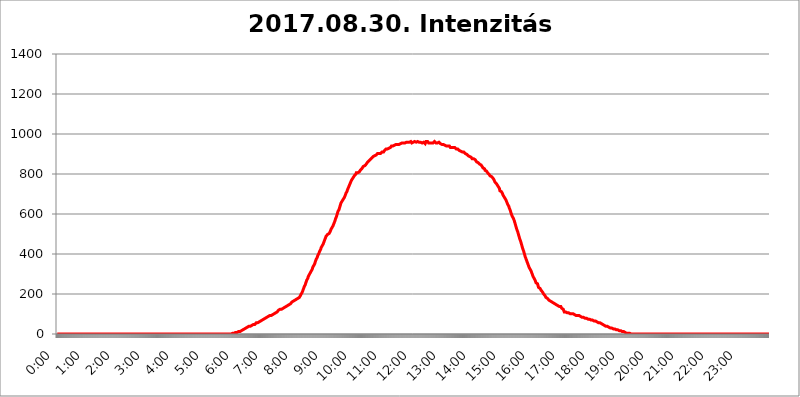
| Category | 2017.08.30. Intenzitás [W/m^2] |
|---|---|
| 0.0 | 0 |
| 0.0006944444444444445 | 0 |
| 0.001388888888888889 | 0 |
| 0.0020833333333333333 | 0 |
| 0.002777777777777778 | 0 |
| 0.003472222222222222 | 0 |
| 0.004166666666666667 | 0 |
| 0.004861111111111111 | 0 |
| 0.005555555555555556 | 0 |
| 0.0062499999999999995 | 0 |
| 0.006944444444444444 | 0 |
| 0.007638888888888889 | 0 |
| 0.008333333333333333 | 0 |
| 0.009027777777777779 | 0 |
| 0.009722222222222222 | 0 |
| 0.010416666666666666 | 0 |
| 0.011111111111111112 | 0 |
| 0.011805555555555555 | 0 |
| 0.012499999999999999 | 0 |
| 0.013194444444444444 | 0 |
| 0.013888888888888888 | 0 |
| 0.014583333333333332 | 0 |
| 0.015277777777777777 | 0 |
| 0.015972222222222224 | 0 |
| 0.016666666666666666 | 0 |
| 0.017361111111111112 | 0 |
| 0.018055555555555557 | 0 |
| 0.01875 | 0 |
| 0.019444444444444445 | 0 |
| 0.02013888888888889 | 0 |
| 0.020833333333333332 | 0 |
| 0.02152777777777778 | 0 |
| 0.022222222222222223 | 0 |
| 0.02291666666666667 | 0 |
| 0.02361111111111111 | 0 |
| 0.024305555555555556 | 0 |
| 0.024999999999999998 | 0 |
| 0.025694444444444447 | 0 |
| 0.02638888888888889 | 0 |
| 0.027083333333333334 | 0 |
| 0.027777777777777776 | 0 |
| 0.02847222222222222 | 0 |
| 0.029166666666666664 | 0 |
| 0.029861111111111113 | 0 |
| 0.030555555555555555 | 0 |
| 0.03125 | 0 |
| 0.03194444444444445 | 0 |
| 0.03263888888888889 | 0 |
| 0.03333333333333333 | 0 |
| 0.034027777777777775 | 0 |
| 0.034722222222222224 | 0 |
| 0.035416666666666666 | 0 |
| 0.036111111111111115 | 0 |
| 0.03680555555555556 | 0 |
| 0.0375 | 0 |
| 0.03819444444444444 | 0 |
| 0.03888888888888889 | 0 |
| 0.03958333333333333 | 0 |
| 0.04027777777777778 | 0 |
| 0.04097222222222222 | 0 |
| 0.041666666666666664 | 0 |
| 0.042361111111111106 | 0 |
| 0.04305555555555556 | 0 |
| 0.043750000000000004 | 0 |
| 0.044444444444444446 | 0 |
| 0.04513888888888889 | 0 |
| 0.04583333333333334 | 0 |
| 0.04652777777777778 | 0 |
| 0.04722222222222222 | 0 |
| 0.04791666666666666 | 0 |
| 0.04861111111111111 | 0 |
| 0.049305555555555554 | 0 |
| 0.049999999999999996 | 0 |
| 0.05069444444444445 | 0 |
| 0.051388888888888894 | 0 |
| 0.052083333333333336 | 0 |
| 0.05277777777777778 | 0 |
| 0.05347222222222222 | 0 |
| 0.05416666666666667 | 0 |
| 0.05486111111111111 | 0 |
| 0.05555555555555555 | 0 |
| 0.05625 | 0 |
| 0.05694444444444444 | 0 |
| 0.057638888888888885 | 0 |
| 0.05833333333333333 | 0 |
| 0.05902777777777778 | 0 |
| 0.059722222222222225 | 0 |
| 0.06041666666666667 | 0 |
| 0.061111111111111116 | 0 |
| 0.06180555555555556 | 0 |
| 0.0625 | 0 |
| 0.06319444444444444 | 0 |
| 0.06388888888888888 | 0 |
| 0.06458333333333334 | 0 |
| 0.06527777777777778 | 0 |
| 0.06597222222222222 | 0 |
| 0.06666666666666667 | 0 |
| 0.06736111111111111 | 0 |
| 0.06805555555555555 | 0 |
| 0.06874999999999999 | 0 |
| 0.06944444444444443 | 0 |
| 0.07013888888888889 | 0 |
| 0.07083333333333333 | 0 |
| 0.07152777777777779 | 0 |
| 0.07222222222222223 | 0 |
| 0.07291666666666667 | 0 |
| 0.07361111111111111 | 0 |
| 0.07430555555555556 | 0 |
| 0.075 | 0 |
| 0.07569444444444444 | 0 |
| 0.0763888888888889 | 0 |
| 0.07708333333333334 | 0 |
| 0.07777777777777778 | 0 |
| 0.07847222222222222 | 0 |
| 0.07916666666666666 | 0 |
| 0.0798611111111111 | 0 |
| 0.08055555555555556 | 0 |
| 0.08125 | 0 |
| 0.08194444444444444 | 0 |
| 0.08263888888888889 | 0 |
| 0.08333333333333333 | 0 |
| 0.08402777777777777 | 0 |
| 0.08472222222222221 | 0 |
| 0.08541666666666665 | 0 |
| 0.08611111111111112 | 0 |
| 0.08680555555555557 | 0 |
| 0.08750000000000001 | 0 |
| 0.08819444444444445 | 0 |
| 0.08888888888888889 | 0 |
| 0.08958333333333333 | 0 |
| 0.09027777777777778 | 0 |
| 0.09097222222222222 | 0 |
| 0.09166666666666667 | 0 |
| 0.09236111111111112 | 0 |
| 0.09305555555555556 | 0 |
| 0.09375 | 0 |
| 0.09444444444444444 | 0 |
| 0.09513888888888888 | 0 |
| 0.09583333333333333 | 0 |
| 0.09652777777777777 | 0 |
| 0.09722222222222222 | 0 |
| 0.09791666666666667 | 0 |
| 0.09861111111111111 | 0 |
| 0.09930555555555555 | 0 |
| 0.09999999999999999 | 0 |
| 0.10069444444444443 | 0 |
| 0.1013888888888889 | 0 |
| 0.10208333333333335 | 0 |
| 0.10277777777777779 | 0 |
| 0.10347222222222223 | 0 |
| 0.10416666666666667 | 0 |
| 0.10486111111111111 | 0 |
| 0.10555555555555556 | 0 |
| 0.10625 | 0 |
| 0.10694444444444444 | 0 |
| 0.1076388888888889 | 0 |
| 0.10833333333333334 | 0 |
| 0.10902777777777778 | 0 |
| 0.10972222222222222 | 0 |
| 0.1111111111111111 | 0 |
| 0.11180555555555556 | 0 |
| 0.11180555555555556 | 0 |
| 0.1125 | 0 |
| 0.11319444444444444 | 0 |
| 0.11388888888888889 | 0 |
| 0.11458333333333333 | 0 |
| 0.11527777777777777 | 0 |
| 0.11597222222222221 | 0 |
| 0.11666666666666665 | 0 |
| 0.1173611111111111 | 0 |
| 0.11805555555555557 | 0 |
| 0.11944444444444445 | 0 |
| 0.12013888888888889 | 0 |
| 0.12083333333333333 | 0 |
| 0.12152777777777778 | 0 |
| 0.12222222222222223 | 0 |
| 0.12291666666666667 | 0 |
| 0.12291666666666667 | 0 |
| 0.12361111111111112 | 0 |
| 0.12430555555555556 | 0 |
| 0.125 | 0 |
| 0.12569444444444444 | 0 |
| 0.12638888888888888 | 0 |
| 0.12708333333333333 | 0 |
| 0.16875 | 0 |
| 0.12847222222222224 | 0 |
| 0.12916666666666668 | 0 |
| 0.12986111111111112 | 0 |
| 0.13055555555555556 | 0 |
| 0.13125 | 0 |
| 0.13194444444444445 | 0 |
| 0.1326388888888889 | 0 |
| 0.13333333333333333 | 0 |
| 0.13402777777777777 | 0 |
| 0.13402777777777777 | 0 |
| 0.13472222222222222 | 0 |
| 0.13541666666666666 | 0 |
| 0.1361111111111111 | 0 |
| 0.13749999999999998 | 0 |
| 0.13819444444444443 | 0 |
| 0.1388888888888889 | 0 |
| 0.13958333333333334 | 0 |
| 0.14027777777777778 | 0 |
| 0.14097222222222222 | 0 |
| 0.14166666666666666 | 0 |
| 0.1423611111111111 | 0 |
| 0.14305555555555557 | 0 |
| 0.14375000000000002 | 0 |
| 0.14444444444444446 | 0 |
| 0.1451388888888889 | 0 |
| 0.1451388888888889 | 0 |
| 0.14652777777777778 | 0 |
| 0.14722222222222223 | 0 |
| 0.14791666666666667 | 0 |
| 0.1486111111111111 | 0 |
| 0.14930555555555555 | 0 |
| 0.15 | 0 |
| 0.15069444444444444 | 0 |
| 0.15138888888888888 | 0 |
| 0.15208333333333332 | 0 |
| 0.15277777777777776 | 0 |
| 0.15347222222222223 | 0 |
| 0.15416666666666667 | 0 |
| 0.15486111111111112 | 0 |
| 0.15555555555555556 | 0 |
| 0.15625 | 0 |
| 0.15694444444444444 | 0 |
| 0.15763888888888888 | 0 |
| 0.15833333333333333 | 0 |
| 0.15902777777777777 | 0 |
| 0.15972222222222224 | 0 |
| 0.16041666666666668 | 0 |
| 0.16111111111111112 | 0 |
| 0.16180555555555556 | 0 |
| 0.1625 | 0 |
| 0.16319444444444445 | 0 |
| 0.1638888888888889 | 0 |
| 0.16458333333333333 | 0 |
| 0.16527777777777777 | 0 |
| 0.16597222222222222 | 0 |
| 0.16666666666666666 | 0 |
| 0.1673611111111111 | 0 |
| 0.16805555555555554 | 0 |
| 0.16874999999999998 | 0 |
| 0.16944444444444443 | 0 |
| 0.17013888888888887 | 0 |
| 0.1708333333333333 | 0 |
| 0.17152777777777775 | 0 |
| 0.17222222222222225 | 0 |
| 0.1729166666666667 | 0 |
| 0.17361111111111113 | 0 |
| 0.17430555555555557 | 0 |
| 0.17500000000000002 | 0 |
| 0.17569444444444446 | 0 |
| 0.1763888888888889 | 0 |
| 0.17708333333333334 | 0 |
| 0.17777777777777778 | 0 |
| 0.17847222222222223 | 0 |
| 0.17916666666666667 | 0 |
| 0.1798611111111111 | 0 |
| 0.18055555555555555 | 0 |
| 0.18125 | 0 |
| 0.18194444444444444 | 0 |
| 0.1826388888888889 | 0 |
| 0.18333333333333335 | 0 |
| 0.1840277777777778 | 0 |
| 0.18472222222222223 | 0 |
| 0.18541666666666667 | 0 |
| 0.18611111111111112 | 0 |
| 0.18680555555555556 | 0 |
| 0.1875 | 0 |
| 0.18819444444444444 | 0 |
| 0.18888888888888888 | 0 |
| 0.18958333333333333 | 0 |
| 0.19027777777777777 | 0 |
| 0.1909722222222222 | 0 |
| 0.19166666666666665 | 0 |
| 0.19236111111111112 | 0 |
| 0.19305555555555554 | 0 |
| 0.19375 | 0 |
| 0.19444444444444445 | 0 |
| 0.1951388888888889 | 0 |
| 0.19583333333333333 | 0 |
| 0.19652777777777777 | 0 |
| 0.19722222222222222 | 0 |
| 0.19791666666666666 | 0 |
| 0.1986111111111111 | 0 |
| 0.19930555555555554 | 0 |
| 0.19999999999999998 | 0 |
| 0.20069444444444443 | 0 |
| 0.20138888888888887 | 0 |
| 0.2020833333333333 | 0 |
| 0.2027777777777778 | 0 |
| 0.2034722222222222 | 0 |
| 0.2041666666666667 | 0 |
| 0.20486111111111113 | 0 |
| 0.20555555555555557 | 0 |
| 0.20625000000000002 | 0 |
| 0.20694444444444446 | 0 |
| 0.2076388888888889 | 0 |
| 0.20833333333333334 | 0 |
| 0.20902777777777778 | 0 |
| 0.20972222222222223 | 0 |
| 0.21041666666666667 | 0 |
| 0.2111111111111111 | 0 |
| 0.21180555555555555 | 0 |
| 0.2125 | 0 |
| 0.21319444444444444 | 0 |
| 0.2138888888888889 | 0 |
| 0.21458333333333335 | 0 |
| 0.2152777777777778 | 0 |
| 0.21597222222222223 | 0 |
| 0.21666666666666667 | 0 |
| 0.21736111111111112 | 0 |
| 0.21805555555555556 | 0 |
| 0.21875 | 0 |
| 0.21944444444444444 | 0 |
| 0.22013888888888888 | 0 |
| 0.22083333333333333 | 0 |
| 0.22152777777777777 | 0 |
| 0.2222222222222222 | 0 |
| 0.22291666666666665 | 0 |
| 0.2236111111111111 | 0 |
| 0.22430555555555556 | 0 |
| 0.225 | 0 |
| 0.22569444444444445 | 0 |
| 0.2263888888888889 | 0 |
| 0.22708333333333333 | 0 |
| 0.22777777777777777 | 0 |
| 0.22847222222222222 | 0 |
| 0.22916666666666666 | 0 |
| 0.2298611111111111 | 0 |
| 0.23055555555555554 | 0 |
| 0.23124999999999998 | 0 |
| 0.23194444444444443 | 0 |
| 0.23263888888888887 | 0 |
| 0.2333333333333333 | 0 |
| 0.2340277777777778 | 0 |
| 0.2347222222222222 | 0 |
| 0.2354166666666667 | 0 |
| 0.23611111111111113 | 0 |
| 0.23680555555555557 | 0 |
| 0.23750000000000002 | 0 |
| 0.23819444444444446 | 0 |
| 0.2388888888888889 | 0 |
| 0.23958333333333334 | 0 |
| 0.24027777777777778 | 0 |
| 0.24097222222222223 | 0 |
| 0.24166666666666667 | 0 |
| 0.2423611111111111 | 0 |
| 0.24305555555555555 | 0 |
| 0.24375 | 0 |
| 0.24444444444444446 | 0 |
| 0.24513888888888888 | 3.525 |
| 0.24583333333333335 | 3.525 |
| 0.2465277777777778 | 3.525 |
| 0.24722222222222223 | 3.525 |
| 0.24791666666666667 | 3.525 |
| 0.24861111111111112 | 3.525 |
| 0.24930555555555556 | 3.525 |
| 0.25 | 7.887 |
| 0.25069444444444444 | 7.887 |
| 0.2513888888888889 | 7.887 |
| 0.2520833333333333 | 7.887 |
| 0.25277777777777777 | 12.257 |
| 0.2534722222222222 | 12.257 |
| 0.25416666666666665 | 12.257 |
| 0.2548611111111111 | 12.257 |
| 0.2555555555555556 | 12.257 |
| 0.25625000000000003 | 12.257 |
| 0.2569444444444445 | 12.257 |
| 0.2576388888888889 | 16.636 |
| 0.25833333333333336 | 16.636 |
| 0.2590277777777778 | 21.024 |
| 0.25972222222222224 | 21.024 |
| 0.2604166666666667 | 21.024 |
| 0.2611111111111111 | 21.024 |
| 0.26180555555555557 | 25.419 |
| 0.2625 | 25.419 |
| 0.26319444444444445 | 25.419 |
| 0.2638888888888889 | 29.823 |
| 0.26458333333333334 | 29.823 |
| 0.2652777777777778 | 29.823 |
| 0.2659722222222222 | 34.234 |
| 0.26666666666666666 | 34.234 |
| 0.2673611111111111 | 34.234 |
| 0.26805555555555555 | 34.234 |
| 0.26875 | 38.653 |
| 0.26944444444444443 | 38.653 |
| 0.2701388888888889 | 38.653 |
| 0.2708333333333333 | 38.653 |
| 0.27152777777777776 | 38.653 |
| 0.2722222222222222 | 43.079 |
| 0.27291666666666664 | 43.079 |
| 0.2736111111111111 | 43.079 |
| 0.2743055555555555 | 47.511 |
| 0.27499999999999997 | 47.511 |
| 0.27569444444444446 | 47.511 |
| 0.27638888888888885 | 47.511 |
| 0.27708333333333335 | 47.511 |
| 0.2777777777777778 | 51.951 |
| 0.27847222222222223 | 51.951 |
| 0.2791666666666667 | 56.398 |
| 0.2798611111111111 | 56.398 |
| 0.28055555555555556 | 56.398 |
| 0.28125 | 56.398 |
| 0.28194444444444444 | 56.398 |
| 0.2826388888888889 | 60.85 |
| 0.2833333333333333 | 60.85 |
| 0.28402777777777777 | 60.85 |
| 0.2847222222222222 | 65.31 |
| 0.28541666666666665 | 65.31 |
| 0.28611111111111115 | 65.31 |
| 0.28680555555555554 | 69.775 |
| 0.28750000000000003 | 69.775 |
| 0.2881944444444445 | 69.775 |
| 0.2888888888888889 | 74.246 |
| 0.28958333333333336 | 74.246 |
| 0.2902777777777778 | 74.246 |
| 0.29097222222222224 | 74.246 |
| 0.2916666666666667 | 78.722 |
| 0.2923611111111111 | 78.722 |
| 0.29305555555555557 | 78.722 |
| 0.29375 | 83.205 |
| 0.29444444444444445 | 83.205 |
| 0.2951388888888889 | 83.205 |
| 0.29583333333333334 | 87.692 |
| 0.2965277777777778 | 87.692 |
| 0.2972222222222222 | 87.692 |
| 0.29791666666666666 | 92.184 |
| 0.2986111111111111 | 92.184 |
| 0.29930555555555555 | 92.184 |
| 0.3 | 92.184 |
| 0.30069444444444443 | 96.682 |
| 0.3013888888888889 | 96.682 |
| 0.3020833333333333 | 96.682 |
| 0.30277777777777776 | 101.184 |
| 0.3034722222222222 | 101.184 |
| 0.30416666666666664 | 101.184 |
| 0.3048611111111111 | 105.69 |
| 0.3055555555555555 | 105.69 |
| 0.30624999999999997 | 105.69 |
| 0.3069444444444444 | 110.201 |
| 0.3076388888888889 | 110.201 |
| 0.30833333333333335 | 110.201 |
| 0.3090277777777778 | 114.716 |
| 0.30972222222222223 | 114.716 |
| 0.3104166666666667 | 119.235 |
| 0.3111111111111111 | 119.235 |
| 0.31180555555555556 | 119.235 |
| 0.3125 | 123.758 |
| 0.31319444444444444 | 123.758 |
| 0.3138888888888889 | 123.758 |
| 0.3145833333333333 | 123.758 |
| 0.31527777777777777 | 128.284 |
| 0.3159722222222222 | 128.284 |
| 0.31666666666666665 | 128.284 |
| 0.31736111111111115 | 128.284 |
| 0.31805555555555554 | 132.814 |
| 0.31875000000000003 | 132.814 |
| 0.3194444444444445 | 132.814 |
| 0.3201388888888889 | 137.347 |
| 0.32083333333333336 | 137.347 |
| 0.3215277777777778 | 137.347 |
| 0.32222222222222224 | 141.884 |
| 0.3229166666666667 | 141.884 |
| 0.3236111111111111 | 146.423 |
| 0.32430555555555557 | 146.423 |
| 0.325 | 146.423 |
| 0.32569444444444445 | 150.964 |
| 0.3263888888888889 | 150.964 |
| 0.32708333333333334 | 150.964 |
| 0.3277777777777778 | 155.509 |
| 0.3284722222222222 | 155.509 |
| 0.32916666666666666 | 160.056 |
| 0.3298611111111111 | 160.056 |
| 0.33055555555555555 | 164.605 |
| 0.33125 | 164.605 |
| 0.33194444444444443 | 164.605 |
| 0.3326388888888889 | 169.156 |
| 0.3333333333333333 | 169.156 |
| 0.3340277777777778 | 169.156 |
| 0.3347222222222222 | 173.709 |
| 0.3354166666666667 | 173.709 |
| 0.3361111111111111 | 173.709 |
| 0.3368055555555556 | 173.709 |
| 0.33749999999999997 | 178.264 |
| 0.33819444444444446 | 178.264 |
| 0.33888888888888885 | 182.82 |
| 0.33958333333333335 | 182.82 |
| 0.34027777777777773 | 182.82 |
| 0.34097222222222223 | 191.937 |
| 0.3416666666666666 | 196.497 |
| 0.3423611111111111 | 201.058 |
| 0.3430555555555555 | 205.62 |
| 0.34375 | 210.182 |
| 0.3444444444444445 | 214.746 |
| 0.3451388888888889 | 223.873 |
| 0.3458333333333334 | 228.436 |
| 0.34652777777777777 | 237.564 |
| 0.34722222222222227 | 242.127 |
| 0.34791666666666665 | 246.689 |
| 0.34861111111111115 | 255.813 |
| 0.34930555555555554 | 260.373 |
| 0.35000000000000003 | 269.49 |
| 0.3506944444444444 | 274.047 |
| 0.3513888888888889 | 278.603 |
| 0.3520833333333333 | 287.709 |
| 0.3527777777777778 | 292.259 |
| 0.3534722222222222 | 296.808 |
| 0.3541666666666667 | 301.354 |
| 0.3548611111111111 | 305.898 |
| 0.35555555555555557 | 310.44 |
| 0.35625 | 314.98 |
| 0.35694444444444445 | 319.517 |
| 0.3576388888888889 | 324.052 |
| 0.35833333333333334 | 333.113 |
| 0.3590277777777778 | 337.639 |
| 0.3597222222222222 | 342.162 |
| 0.36041666666666666 | 346.682 |
| 0.3611111111111111 | 351.198 |
| 0.36180555555555555 | 360.221 |
| 0.3625 | 364.728 |
| 0.36319444444444443 | 373.729 |
| 0.3638888888888889 | 378.224 |
| 0.3645833333333333 | 382.715 |
| 0.3652777777777778 | 391.685 |
| 0.3659722222222222 | 396.164 |
| 0.3666666666666667 | 400.638 |
| 0.3673611111111111 | 405.108 |
| 0.3680555555555556 | 414.035 |
| 0.36874999999999997 | 418.492 |
| 0.36944444444444446 | 422.943 |
| 0.37013888888888885 | 431.833 |
| 0.37083333333333335 | 436.27 |
| 0.37152777777777773 | 440.702 |
| 0.37222222222222223 | 445.129 |
| 0.3729166666666666 | 449.551 |
| 0.3736111111111111 | 453.968 |
| 0.3743055555555555 | 462.786 |
| 0.375 | 467.187 |
| 0.3756944444444445 | 475.972 |
| 0.3763888888888889 | 480.356 |
| 0.3770833333333334 | 489.108 |
| 0.37777777777777777 | 489.108 |
| 0.37847222222222227 | 493.475 |
| 0.37916666666666665 | 497.836 |
| 0.37986111111111115 | 497.836 |
| 0.38055555555555554 | 502.192 |
| 0.38125000000000003 | 502.192 |
| 0.3819444444444444 | 506.542 |
| 0.3826388888888889 | 510.885 |
| 0.3833333333333333 | 515.223 |
| 0.3840277777777778 | 523.88 |
| 0.3847222222222222 | 523.88 |
| 0.3854166666666667 | 532.513 |
| 0.3861111111111111 | 536.82 |
| 0.38680555555555557 | 541.121 |
| 0.3875 | 545.416 |
| 0.38819444444444445 | 553.986 |
| 0.3888888888888889 | 558.261 |
| 0.38958333333333334 | 566.793 |
| 0.3902777777777778 | 575.299 |
| 0.3909722222222222 | 579.542 |
| 0.39166666666666666 | 588.009 |
| 0.3923611111111111 | 596.45 |
| 0.39305555555555555 | 600.661 |
| 0.39375 | 613.252 |
| 0.39444444444444443 | 617.436 |
| 0.3951388888888889 | 621.613 |
| 0.3958333333333333 | 625.784 |
| 0.3965277777777778 | 638.256 |
| 0.3972222222222222 | 646.537 |
| 0.3979166666666667 | 654.791 |
| 0.3986111111111111 | 658.909 |
| 0.3993055555555556 | 658.909 |
| 0.39999999999999997 | 667.123 |
| 0.40069444444444446 | 671.22 |
| 0.40138888888888885 | 675.311 |
| 0.40208333333333335 | 675.311 |
| 0.40277777777777773 | 683.473 |
| 0.40347222222222223 | 687.544 |
| 0.4041666666666666 | 695.666 |
| 0.4048611111111111 | 703.762 |
| 0.4055555555555555 | 707.8 |
| 0.40625 | 711.832 |
| 0.4069444444444445 | 719.877 |
| 0.4076388888888889 | 723.889 |
| 0.4083333333333334 | 731.896 |
| 0.40902777777777777 | 735.89 |
| 0.40972222222222227 | 743.859 |
| 0.41041666666666665 | 747.834 |
| 0.41111111111111115 | 755.766 |
| 0.41180555555555554 | 759.723 |
| 0.41250000000000003 | 767.62 |
| 0.4131944444444444 | 771.559 |
| 0.4138888888888889 | 775.492 |
| 0.4145833333333333 | 779.42 |
| 0.4152777777777778 | 783.342 |
| 0.4159722222222222 | 787.258 |
| 0.4166666666666667 | 791.169 |
| 0.4173611111111111 | 795.074 |
| 0.41805555555555557 | 795.074 |
| 0.41875 | 798.974 |
| 0.41944444444444445 | 806.757 |
| 0.4201388888888889 | 806.757 |
| 0.42083333333333334 | 806.757 |
| 0.4215277777777778 | 806.757 |
| 0.4222222222222222 | 806.757 |
| 0.42291666666666666 | 806.757 |
| 0.4236111111111111 | 810.641 |
| 0.42430555555555555 | 814.519 |
| 0.425 | 818.392 |
| 0.42569444444444443 | 822.26 |
| 0.4263888888888889 | 822.26 |
| 0.4270833333333333 | 826.123 |
| 0.4277777777777778 | 829.981 |
| 0.4284722222222222 | 829.981 |
| 0.4291666666666667 | 837.682 |
| 0.4298611111111111 | 837.682 |
| 0.4305555555555556 | 837.682 |
| 0.43124999999999997 | 841.526 |
| 0.43194444444444446 | 845.365 |
| 0.43263888888888885 | 845.365 |
| 0.43333333333333335 | 849.199 |
| 0.43402777777777773 | 853.029 |
| 0.43472222222222223 | 856.855 |
| 0.4354166666666666 | 860.676 |
| 0.4361111111111111 | 860.676 |
| 0.4368055555555555 | 864.493 |
| 0.4375 | 864.493 |
| 0.4381944444444445 | 868.305 |
| 0.4388888888888889 | 872.114 |
| 0.4395833333333334 | 875.918 |
| 0.44027777777777777 | 875.918 |
| 0.44097222222222227 | 879.719 |
| 0.44166666666666665 | 883.516 |
| 0.44236111111111115 | 883.516 |
| 0.44305555555555554 | 887.309 |
| 0.44375000000000003 | 887.309 |
| 0.4444444444444444 | 887.309 |
| 0.4451388888888889 | 891.099 |
| 0.4458333333333333 | 891.099 |
| 0.4465277777777778 | 894.885 |
| 0.4472222222222222 | 894.885 |
| 0.4479166666666667 | 894.885 |
| 0.4486111111111111 | 898.668 |
| 0.44930555555555557 | 902.447 |
| 0.45 | 902.447 |
| 0.45069444444444445 | 902.447 |
| 0.4513888888888889 | 902.447 |
| 0.45208333333333334 | 902.447 |
| 0.4527777777777778 | 902.447 |
| 0.4534722222222222 | 902.447 |
| 0.45416666666666666 | 906.223 |
| 0.4548611111111111 | 906.223 |
| 0.45555555555555555 | 909.996 |
| 0.45625 | 909.996 |
| 0.45694444444444443 | 909.996 |
| 0.4576388888888889 | 909.996 |
| 0.4583333333333333 | 913.766 |
| 0.4590277777777778 | 917.534 |
| 0.4597222222222222 | 921.298 |
| 0.4604166666666667 | 921.298 |
| 0.4611111111111111 | 925.06 |
| 0.4618055555555556 | 925.06 |
| 0.46249999999999997 | 925.06 |
| 0.46319444444444446 | 925.06 |
| 0.46388888888888885 | 925.06 |
| 0.46458333333333335 | 928.819 |
| 0.46527777777777773 | 928.819 |
| 0.46597222222222223 | 932.576 |
| 0.4666666666666666 | 932.576 |
| 0.4673611111111111 | 932.576 |
| 0.4680555555555555 | 936.33 |
| 0.46875 | 940.082 |
| 0.4694444444444445 | 940.082 |
| 0.4701388888888889 | 940.082 |
| 0.4708333333333334 | 940.082 |
| 0.47152777777777777 | 940.082 |
| 0.47222222222222227 | 943.832 |
| 0.47291666666666665 | 943.832 |
| 0.47361111111111115 | 947.58 |
| 0.47430555555555554 | 943.832 |
| 0.47500000000000003 | 947.58 |
| 0.4756944444444444 | 943.832 |
| 0.4763888888888889 | 943.832 |
| 0.4770833333333333 | 947.58 |
| 0.4777777777777778 | 947.58 |
| 0.4784722222222222 | 947.58 |
| 0.4791666666666667 | 947.58 |
| 0.4798611111111111 | 947.58 |
| 0.48055555555555557 | 947.58 |
| 0.48125 | 951.327 |
| 0.48194444444444445 | 951.327 |
| 0.4826388888888889 | 955.071 |
| 0.48333333333333334 | 955.071 |
| 0.4840277777777778 | 955.071 |
| 0.4847222222222222 | 955.071 |
| 0.48541666666666666 | 955.071 |
| 0.4861111111111111 | 955.071 |
| 0.48680555555555555 | 955.071 |
| 0.4875 | 955.071 |
| 0.48819444444444443 | 955.071 |
| 0.4888888888888889 | 955.071 |
| 0.4895833333333333 | 958.814 |
| 0.4902777777777778 | 955.071 |
| 0.4909722222222222 | 958.814 |
| 0.4916666666666667 | 958.814 |
| 0.4923611111111111 | 958.814 |
| 0.4930555555555556 | 955.071 |
| 0.49374999999999997 | 958.814 |
| 0.49444444444444446 | 958.814 |
| 0.49513888888888885 | 958.814 |
| 0.49583333333333335 | 962.555 |
| 0.49652777777777773 | 958.814 |
| 0.49722222222222223 | 955.071 |
| 0.4979166666666666 | 955.071 |
| 0.4986111111111111 | 955.071 |
| 0.4993055555555555 | 958.814 |
| 0.5 | 962.555 |
| 0.5006944444444444 | 962.555 |
| 0.5013888888888889 | 962.555 |
| 0.5020833333333333 | 962.555 |
| 0.5027777777777778 | 962.555 |
| 0.5034722222222222 | 958.814 |
| 0.5041666666666667 | 958.814 |
| 0.5048611111111111 | 958.814 |
| 0.5055555555555555 | 962.555 |
| 0.50625 | 962.555 |
| 0.5069444444444444 | 962.555 |
| 0.5076388888888889 | 958.814 |
| 0.5083333333333333 | 958.814 |
| 0.5090277777777777 | 962.555 |
| 0.5097222222222222 | 958.814 |
| 0.5104166666666666 | 958.814 |
| 0.5111111111111112 | 955.071 |
| 0.5118055555555555 | 955.071 |
| 0.5125000000000001 | 955.071 |
| 0.5131944444444444 | 955.071 |
| 0.513888888888889 | 958.814 |
| 0.5145833333333333 | 958.814 |
| 0.5152777777777778 | 958.814 |
| 0.5159722222222222 | 951.327 |
| 0.5166666666666667 | 955.071 |
| 0.517361111111111 | 962.555 |
| 0.5180555555555556 | 962.555 |
| 0.5187499999999999 | 962.555 |
| 0.5194444444444445 | 962.555 |
| 0.5201388888888888 | 958.814 |
| 0.5208333333333334 | 955.071 |
| 0.5215277777777778 | 958.814 |
| 0.5222222222222223 | 955.071 |
| 0.5229166666666667 | 955.071 |
| 0.5236111111111111 | 955.071 |
| 0.5243055555555556 | 955.071 |
| 0.525 | 955.071 |
| 0.5256944444444445 | 955.071 |
| 0.5263888888888889 | 955.071 |
| 0.5270833333333333 | 955.071 |
| 0.5277777777777778 | 958.814 |
| 0.5284722222222222 | 958.814 |
| 0.5291666666666667 | 962.555 |
| 0.5298611111111111 | 958.814 |
| 0.5305555555555556 | 958.814 |
| 0.53125 | 955.071 |
| 0.5319444444444444 | 955.071 |
| 0.5326388888888889 | 955.071 |
| 0.5333333333333333 | 955.071 |
| 0.5340277777777778 | 955.071 |
| 0.5347222222222222 | 958.814 |
| 0.5354166666666667 | 958.814 |
| 0.5361111111111111 | 955.071 |
| 0.5368055555555555 | 955.071 |
| 0.5375 | 951.327 |
| 0.5381944444444444 | 951.327 |
| 0.5388888888888889 | 951.327 |
| 0.5395833333333333 | 947.58 |
| 0.5402777777777777 | 947.58 |
| 0.5409722222222222 | 943.832 |
| 0.5416666666666666 | 947.58 |
| 0.5423611111111112 | 947.58 |
| 0.5430555555555555 | 947.58 |
| 0.5437500000000001 | 943.832 |
| 0.5444444444444444 | 943.832 |
| 0.545138888888889 | 943.832 |
| 0.5458333333333333 | 940.082 |
| 0.5465277777777778 | 940.082 |
| 0.5472222222222222 | 943.832 |
| 0.5479166666666667 | 940.082 |
| 0.548611111111111 | 940.082 |
| 0.5493055555555556 | 936.33 |
| 0.5499999999999999 | 940.082 |
| 0.5506944444444445 | 936.33 |
| 0.5513888888888888 | 932.576 |
| 0.5520833333333334 | 932.576 |
| 0.5527777777777778 | 932.576 |
| 0.5534722222222223 | 932.576 |
| 0.5541666666666667 | 932.576 |
| 0.5548611111111111 | 932.576 |
| 0.5555555555555556 | 932.576 |
| 0.55625 | 932.576 |
| 0.5569444444444445 | 932.576 |
| 0.5576388888888889 | 932.576 |
| 0.5583333333333333 | 928.819 |
| 0.5590277777777778 | 928.819 |
| 0.5597222222222222 | 925.06 |
| 0.5604166666666667 | 921.298 |
| 0.5611111111111111 | 921.298 |
| 0.5618055555555556 | 925.06 |
| 0.5625 | 921.298 |
| 0.5631944444444444 | 921.298 |
| 0.5638888888888889 | 917.534 |
| 0.5645833333333333 | 917.534 |
| 0.5652777777777778 | 917.534 |
| 0.5659722222222222 | 913.766 |
| 0.5666666666666667 | 909.996 |
| 0.5673611111111111 | 909.996 |
| 0.5680555555555555 | 909.996 |
| 0.56875 | 906.223 |
| 0.5694444444444444 | 909.996 |
| 0.5701388888888889 | 909.996 |
| 0.5708333333333333 | 906.223 |
| 0.5715277777777777 | 906.223 |
| 0.5722222222222222 | 902.447 |
| 0.5729166666666666 | 902.447 |
| 0.5736111111111112 | 898.668 |
| 0.5743055555555555 | 898.668 |
| 0.5750000000000001 | 894.885 |
| 0.5756944444444444 | 894.885 |
| 0.576388888888889 | 891.099 |
| 0.5770833333333333 | 891.099 |
| 0.5777777777777778 | 891.099 |
| 0.5784722222222222 | 887.309 |
| 0.5791666666666667 | 887.309 |
| 0.579861111111111 | 883.516 |
| 0.5805555555555556 | 883.516 |
| 0.5812499999999999 | 883.516 |
| 0.5819444444444445 | 875.918 |
| 0.5826388888888888 | 875.918 |
| 0.5833333333333334 | 875.918 |
| 0.5840277777777778 | 875.918 |
| 0.5847222222222223 | 875.918 |
| 0.5854166666666667 | 872.114 |
| 0.5861111111111111 | 872.114 |
| 0.5868055555555556 | 868.305 |
| 0.5875 | 868.305 |
| 0.5881944444444445 | 860.676 |
| 0.5888888888888889 | 860.676 |
| 0.5895833333333333 | 860.676 |
| 0.5902777777777778 | 856.855 |
| 0.5909722222222222 | 856.855 |
| 0.5916666666666667 | 853.029 |
| 0.5923611111111111 | 849.199 |
| 0.5930555555555556 | 849.199 |
| 0.59375 | 849.199 |
| 0.5944444444444444 | 845.365 |
| 0.5951388888888889 | 841.526 |
| 0.5958333333333333 | 837.682 |
| 0.5965277777777778 | 833.834 |
| 0.5972222222222222 | 829.981 |
| 0.5979166666666667 | 829.981 |
| 0.5986111111111111 | 826.123 |
| 0.5993055555555555 | 826.123 |
| 0.6 | 818.392 |
| 0.6006944444444444 | 818.392 |
| 0.6013888888888889 | 818.392 |
| 0.6020833333333333 | 814.519 |
| 0.6027777777777777 | 810.641 |
| 0.6034722222222222 | 806.757 |
| 0.6041666666666666 | 810.641 |
| 0.6048611111111112 | 802.868 |
| 0.6055555555555555 | 798.974 |
| 0.6062500000000001 | 795.074 |
| 0.6069444444444444 | 791.169 |
| 0.607638888888889 | 791.169 |
| 0.6083333333333333 | 787.258 |
| 0.6090277777777778 | 787.258 |
| 0.6097222222222222 | 783.342 |
| 0.6104166666666667 | 783.342 |
| 0.611111111111111 | 779.42 |
| 0.6118055555555556 | 775.492 |
| 0.6124999999999999 | 771.559 |
| 0.6131944444444445 | 767.62 |
| 0.6138888888888888 | 759.723 |
| 0.6145833333333334 | 759.723 |
| 0.6152777777777778 | 755.766 |
| 0.6159722222222223 | 751.803 |
| 0.6166666666666667 | 751.803 |
| 0.6173611111111111 | 743.859 |
| 0.6180555555555556 | 739.877 |
| 0.61875 | 735.89 |
| 0.6194444444444445 | 731.896 |
| 0.6201388888888889 | 727.896 |
| 0.6208333333333333 | 715.858 |
| 0.6215277777777778 | 715.858 |
| 0.6222222222222222 | 711.832 |
| 0.6229166666666667 | 711.832 |
| 0.6236111111111111 | 707.8 |
| 0.6243055555555556 | 703.762 |
| 0.625 | 695.666 |
| 0.6256944444444444 | 695.666 |
| 0.6263888888888889 | 687.544 |
| 0.6270833333333333 | 683.473 |
| 0.6277777777777778 | 679.395 |
| 0.6284722222222222 | 675.311 |
| 0.6291666666666667 | 671.22 |
| 0.6298611111111111 | 667.123 |
| 0.6305555555555555 | 658.909 |
| 0.63125 | 654.791 |
| 0.6319444444444444 | 646.537 |
| 0.6326388888888889 | 642.4 |
| 0.6333333333333333 | 638.256 |
| 0.6340277777777777 | 629.948 |
| 0.6347222222222222 | 625.784 |
| 0.6354166666666666 | 617.436 |
| 0.6361111111111112 | 609.062 |
| 0.6368055555555555 | 600.661 |
| 0.6375000000000001 | 596.45 |
| 0.6381944444444444 | 588.009 |
| 0.638888888888889 | 583.779 |
| 0.6395833333333333 | 579.542 |
| 0.6402777777777778 | 575.299 |
| 0.6409722222222222 | 566.793 |
| 0.6416666666666667 | 558.261 |
| 0.642361111111111 | 549.704 |
| 0.6430555555555556 | 541.121 |
| 0.6437499999999999 | 532.513 |
| 0.6444444444444445 | 523.88 |
| 0.6451388888888888 | 519.555 |
| 0.6458333333333334 | 510.885 |
| 0.6465277777777778 | 502.192 |
| 0.6472222222222223 | 493.475 |
| 0.6479166666666667 | 489.108 |
| 0.6486111111111111 | 475.972 |
| 0.6493055555555556 | 471.582 |
| 0.65 | 462.786 |
| 0.6506944444444445 | 453.968 |
| 0.6513888888888889 | 445.129 |
| 0.6520833333333333 | 436.27 |
| 0.6527777777777778 | 427.39 |
| 0.6534722222222222 | 422.943 |
| 0.6541666666666667 | 414.035 |
| 0.6548611111111111 | 405.108 |
| 0.6555555555555556 | 396.164 |
| 0.65625 | 387.202 |
| 0.6569444444444444 | 382.715 |
| 0.6576388888888889 | 373.729 |
| 0.6583333333333333 | 369.23 |
| 0.6590277777777778 | 360.221 |
| 0.6597222222222222 | 355.712 |
| 0.6604166666666667 | 346.682 |
| 0.6611111111111111 | 342.162 |
| 0.6618055555555555 | 333.113 |
| 0.6625 | 333.113 |
| 0.6631944444444444 | 324.052 |
| 0.6638888888888889 | 319.517 |
| 0.6645833333333333 | 314.98 |
| 0.6652777777777777 | 310.44 |
| 0.6659722222222222 | 301.354 |
| 0.6666666666666666 | 296.808 |
| 0.6673611111111111 | 287.709 |
| 0.6680555555555556 | 283.156 |
| 0.6687500000000001 | 278.603 |
| 0.6694444444444444 | 274.047 |
| 0.6701388888888888 | 269.49 |
| 0.6708333333333334 | 264.932 |
| 0.6715277777777778 | 255.813 |
| 0.6722222222222222 | 251.251 |
| 0.6729166666666666 | 251.251 |
| 0.6736111111111112 | 251.251 |
| 0.6743055555555556 | 242.127 |
| 0.6749999999999999 | 233 |
| 0.6756944444444444 | 233 |
| 0.6763888888888889 | 233 |
| 0.6770833333333334 | 228.436 |
| 0.6777777777777777 | 223.873 |
| 0.6784722222222223 | 219.309 |
| 0.6791666666666667 | 219.309 |
| 0.6798611111111111 | 214.746 |
| 0.6805555555555555 | 210.182 |
| 0.68125 | 205.62 |
| 0.6819444444444445 | 201.058 |
| 0.6826388888888889 | 201.058 |
| 0.6833333333333332 | 196.497 |
| 0.6840277777777778 | 191.937 |
| 0.6847222222222222 | 187.378 |
| 0.6854166666666667 | 182.82 |
| 0.686111111111111 | 182.82 |
| 0.6868055555555556 | 182.82 |
| 0.6875 | 178.264 |
| 0.6881944444444444 | 173.709 |
| 0.688888888888889 | 173.709 |
| 0.6895833333333333 | 169.156 |
| 0.6902777777777778 | 169.156 |
| 0.6909722222222222 | 169.156 |
| 0.6916666666666668 | 164.605 |
| 0.6923611111111111 | 164.605 |
| 0.6930555555555555 | 164.605 |
| 0.69375 | 160.056 |
| 0.6944444444444445 | 160.056 |
| 0.6951388888888889 | 155.509 |
| 0.6958333333333333 | 155.509 |
| 0.6965277777777777 | 155.509 |
| 0.6972222222222223 | 155.509 |
| 0.6979166666666666 | 150.964 |
| 0.6986111111111111 | 150.964 |
| 0.6993055555555556 | 150.964 |
| 0.7000000000000001 | 146.423 |
| 0.7006944444444444 | 146.423 |
| 0.7013888888888888 | 141.884 |
| 0.7020833333333334 | 141.884 |
| 0.7027777777777778 | 141.884 |
| 0.7034722222222222 | 137.347 |
| 0.7041666666666666 | 137.347 |
| 0.7048611111111112 | 137.347 |
| 0.7055555555555556 | 137.347 |
| 0.7062499999999999 | 137.347 |
| 0.7069444444444444 | 132.814 |
| 0.7076388888888889 | 128.284 |
| 0.7083333333333334 | 128.284 |
| 0.7090277777777777 | 128.284 |
| 0.7097222222222223 | 123.758 |
| 0.7104166666666667 | 119.235 |
| 0.7111111111111111 | 110.201 |
| 0.7118055555555555 | 110.201 |
| 0.7125 | 110.201 |
| 0.7131944444444445 | 110.201 |
| 0.7138888888888889 | 110.201 |
| 0.7145833333333332 | 110.201 |
| 0.7152777777777778 | 105.69 |
| 0.7159722222222222 | 105.69 |
| 0.7166666666666667 | 105.69 |
| 0.717361111111111 | 105.69 |
| 0.7180555555555556 | 105.69 |
| 0.71875 | 101.184 |
| 0.7194444444444444 | 101.184 |
| 0.720138888888889 | 101.184 |
| 0.7208333333333333 | 101.184 |
| 0.7215277777777778 | 101.184 |
| 0.7222222222222222 | 101.184 |
| 0.7229166666666668 | 101.184 |
| 0.7236111111111111 | 101.184 |
| 0.7243055555555555 | 96.682 |
| 0.725 | 96.682 |
| 0.7256944444444445 | 96.682 |
| 0.7263888888888889 | 96.682 |
| 0.7270833333333333 | 96.682 |
| 0.7277777777777777 | 92.184 |
| 0.7284722222222223 | 92.184 |
| 0.7291666666666666 | 92.184 |
| 0.7298611111111111 | 92.184 |
| 0.7305555555555556 | 92.184 |
| 0.7312500000000001 | 92.184 |
| 0.7319444444444444 | 92.184 |
| 0.7326388888888888 | 87.692 |
| 0.7333333333333334 | 87.692 |
| 0.7340277777777778 | 87.692 |
| 0.7347222222222222 | 87.692 |
| 0.7354166666666666 | 83.205 |
| 0.7361111111111112 | 83.205 |
| 0.7368055555555556 | 83.205 |
| 0.7374999999999999 | 83.205 |
| 0.7381944444444444 | 83.205 |
| 0.7388888888888889 | 83.205 |
| 0.7395833333333334 | 78.722 |
| 0.7402777777777777 | 78.722 |
| 0.7409722222222223 | 78.722 |
| 0.7416666666666667 | 78.722 |
| 0.7423611111111111 | 78.722 |
| 0.7430555555555555 | 74.246 |
| 0.74375 | 74.246 |
| 0.7444444444444445 | 74.246 |
| 0.7451388888888889 | 74.246 |
| 0.7458333333333332 | 74.246 |
| 0.7465277777777778 | 74.246 |
| 0.7472222222222222 | 74.246 |
| 0.7479166666666667 | 69.775 |
| 0.748611111111111 | 69.775 |
| 0.7493055555555556 | 69.775 |
| 0.75 | 69.775 |
| 0.7506944444444444 | 69.775 |
| 0.751388888888889 | 69.775 |
| 0.7520833333333333 | 65.31 |
| 0.7527777777777778 | 65.31 |
| 0.7534722222222222 | 65.31 |
| 0.7541666666666668 | 65.31 |
| 0.7548611111111111 | 65.31 |
| 0.7555555555555555 | 65.31 |
| 0.75625 | 60.85 |
| 0.7569444444444445 | 60.85 |
| 0.7576388888888889 | 60.85 |
| 0.7583333333333333 | 60.85 |
| 0.7590277777777777 | 56.398 |
| 0.7597222222222223 | 56.398 |
| 0.7604166666666666 | 56.398 |
| 0.7611111111111111 | 56.398 |
| 0.7618055555555556 | 56.398 |
| 0.7625000000000001 | 51.951 |
| 0.7631944444444444 | 51.951 |
| 0.7638888888888888 | 51.951 |
| 0.7645833333333334 | 47.511 |
| 0.7652777777777778 | 47.511 |
| 0.7659722222222222 | 47.511 |
| 0.7666666666666666 | 47.511 |
| 0.7673611111111112 | 43.079 |
| 0.7680555555555556 | 43.079 |
| 0.7687499999999999 | 43.079 |
| 0.7694444444444444 | 38.653 |
| 0.7701388888888889 | 38.653 |
| 0.7708333333333334 | 38.653 |
| 0.7715277777777777 | 38.653 |
| 0.7722222222222223 | 38.653 |
| 0.7729166666666667 | 34.234 |
| 0.7736111111111111 | 34.234 |
| 0.7743055555555555 | 34.234 |
| 0.775 | 34.234 |
| 0.7756944444444445 | 29.823 |
| 0.7763888888888889 | 29.823 |
| 0.7770833333333332 | 29.823 |
| 0.7777777777777778 | 29.823 |
| 0.7784722222222222 | 29.823 |
| 0.7791666666666667 | 29.823 |
| 0.779861111111111 | 25.419 |
| 0.7805555555555556 | 25.419 |
| 0.78125 | 25.419 |
| 0.7819444444444444 | 25.419 |
| 0.782638888888889 | 25.419 |
| 0.7833333333333333 | 21.024 |
| 0.7840277777777778 | 21.024 |
| 0.7847222222222222 | 21.024 |
| 0.7854166666666668 | 21.024 |
| 0.7861111111111111 | 21.024 |
| 0.7868055555555555 | 21.024 |
| 0.7875 | 21.024 |
| 0.7881944444444445 | 16.636 |
| 0.7888888888888889 | 16.636 |
| 0.7895833333333333 | 16.636 |
| 0.7902777777777777 | 16.636 |
| 0.7909722222222223 | 12.257 |
| 0.7916666666666666 | 12.257 |
| 0.7923611111111111 | 12.257 |
| 0.7930555555555556 | 12.257 |
| 0.7937500000000001 | 12.257 |
| 0.7944444444444444 | 12.257 |
| 0.7951388888888888 | 7.887 |
| 0.7958333333333334 | 7.887 |
| 0.7965277777777778 | 7.887 |
| 0.7972222222222222 | 7.887 |
| 0.7979166666666666 | 7.887 |
| 0.7986111111111112 | 3.525 |
| 0.7993055555555556 | 3.525 |
| 0.7999999999999999 | 3.525 |
| 0.8006944444444444 | 3.525 |
| 0.8013888888888889 | 3.525 |
| 0.8020833333333334 | 3.525 |
| 0.8027777777777777 | 3.525 |
| 0.8034722222222223 | 3.525 |
| 0.8041666666666667 | 0 |
| 0.8048611111111111 | 0 |
| 0.8055555555555555 | 0 |
| 0.80625 | 0 |
| 0.8069444444444445 | 0 |
| 0.8076388888888889 | 0 |
| 0.8083333333333332 | 0 |
| 0.8090277777777778 | 0 |
| 0.8097222222222222 | 0 |
| 0.8104166666666667 | 0 |
| 0.811111111111111 | 0 |
| 0.8118055555555556 | 0 |
| 0.8125 | 0 |
| 0.8131944444444444 | 0 |
| 0.813888888888889 | 0 |
| 0.8145833333333333 | 0 |
| 0.8152777777777778 | 0 |
| 0.8159722222222222 | 0 |
| 0.8166666666666668 | 0 |
| 0.8173611111111111 | 0 |
| 0.8180555555555555 | 0 |
| 0.81875 | 0 |
| 0.8194444444444445 | 0 |
| 0.8201388888888889 | 0 |
| 0.8208333333333333 | 0 |
| 0.8215277777777777 | 0 |
| 0.8222222222222223 | 0 |
| 0.8229166666666666 | 0 |
| 0.8236111111111111 | 0 |
| 0.8243055555555556 | 0 |
| 0.8250000000000001 | 0 |
| 0.8256944444444444 | 0 |
| 0.8263888888888888 | 0 |
| 0.8270833333333334 | 0 |
| 0.8277777777777778 | 0 |
| 0.8284722222222222 | 0 |
| 0.8291666666666666 | 0 |
| 0.8298611111111112 | 0 |
| 0.8305555555555556 | 0 |
| 0.8312499999999999 | 0 |
| 0.8319444444444444 | 0 |
| 0.8326388888888889 | 0 |
| 0.8333333333333334 | 0 |
| 0.8340277777777777 | 0 |
| 0.8347222222222223 | 0 |
| 0.8354166666666667 | 0 |
| 0.8361111111111111 | 0 |
| 0.8368055555555555 | 0 |
| 0.8375 | 0 |
| 0.8381944444444445 | 0 |
| 0.8388888888888889 | 0 |
| 0.8395833333333332 | 0 |
| 0.8402777777777778 | 0 |
| 0.8409722222222222 | 0 |
| 0.8416666666666667 | 0 |
| 0.842361111111111 | 0 |
| 0.8430555555555556 | 0 |
| 0.84375 | 0 |
| 0.8444444444444444 | 0 |
| 0.845138888888889 | 0 |
| 0.8458333333333333 | 0 |
| 0.8465277777777778 | 0 |
| 0.8472222222222222 | 0 |
| 0.8479166666666668 | 0 |
| 0.8486111111111111 | 0 |
| 0.8493055555555555 | 0 |
| 0.85 | 0 |
| 0.8506944444444445 | 0 |
| 0.8513888888888889 | 0 |
| 0.8520833333333333 | 0 |
| 0.8527777777777777 | 0 |
| 0.8534722222222223 | 0 |
| 0.8541666666666666 | 0 |
| 0.8548611111111111 | 0 |
| 0.8555555555555556 | 0 |
| 0.8562500000000001 | 0 |
| 0.8569444444444444 | 0 |
| 0.8576388888888888 | 0 |
| 0.8583333333333334 | 0 |
| 0.8590277777777778 | 0 |
| 0.8597222222222222 | 0 |
| 0.8604166666666666 | 0 |
| 0.8611111111111112 | 0 |
| 0.8618055555555556 | 0 |
| 0.8624999999999999 | 0 |
| 0.8631944444444444 | 0 |
| 0.8638888888888889 | 0 |
| 0.8645833333333334 | 0 |
| 0.8652777777777777 | 0 |
| 0.8659722222222223 | 0 |
| 0.8666666666666667 | 0 |
| 0.8673611111111111 | 0 |
| 0.8680555555555555 | 0 |
| 0.86875 | 0 |
| 0.8694444444444445 | 0 |
| 0.8701388888888889 | 0 |
| 0.8708333333333332 | 0 |
| 0.8715277777777778 | 0 |
| 0.8722222222222222 | 0 |
| 0.8729166666666667 | 0 |
| 0.873611111111111 | 0 |
| 0.8743055555555556 | 0 |
| 0.875 | 0 |
| 0.8756944444444444 | 0 |
| 0.876388888888889 | 0 |
| 0.8770833333333333 | 0 |
| 0.8777777777777778 | 0 |
| 0.8784722222222222 | 0 |
| 0.8791666666666668 | 0 |
| 0.8798611111111111 | 0 |
| 0.8805555555555555 | 0 |
| 0.88125 | 0 |
| 0.8819444444444445 | 0 |
| 0.8826388888888889 | 0 |
| 0.8833333333333333 | 0 |
| 0.8840277777777777 | 0 |
| 0.8847222222222223 | 0 |
| 0.8854166666666666 | 0 |
| 0.8861111111111111 | 0 |
| 0.8868055555555556 | 0 |
| 0.8875000000000001 | 0 |
| 0.8881944444444444 | 0 |
| 0.8888888888888888 | 0 |
| 0.8895833333333334 | 0 |
| 0.8902777777777778 | 0 |
| 0.8909722222222222 | 0 |
| 0.8916666666666666 | 0 |
| 0.8923611111111112 | 0 |
| 0.8930555555555556 | 0 |
| 0.8937499999999999 | 0 |
| 0.8944444444444444 | 0 |
| 0.8951388888888889 | 0 |
| 0.8958333333333334 | 0 |
| 0.8965277777777777 | 0 |
| 0.8972222222222223 | 0 |
| 0.8979166666666667 | 0 |
| 0.8986111111111111 | 0 |
| 0.8993055555555555 | 0 |
| 0.9 | 0 |
| 0.9006944444444445 | 0 |
| 0.9013888888888889 | 0 |
| 0.9020833333333332 | 0 |
| 0.9027777777777778 | 0 |
| 0.9034722222222222 | 0 |
| 0.9041666666666667 | 0 |
| 0.904861111111111 | 0 |
| 0.9055555555555556 | 0 |
| 0.90625 | 0 |
| 0.9069444444444444 | 0 |
| 0.907638888888889 | 0 |
| 0.9083333333333333 | 0 |
| 0.9090277777777778 | 0 |
| 0.9097222222222222 | 0 |
| 0.9104166666666668 | 0 |
| 0.9111111111111111 | 0 |
| 0.9118055555555555 | 0 |
| 0.9125 | 0 |
| 0.9131944444444445 | 0 |
| 0.9138888888888889 | 0 |
| 0.9145833333333333 | 0 |
| 0.9152777777777777 | 0 |
| 0.9159722222222223 | 0 |
| 0.9166666666666666 | 0 |
| 0.9173611111111111 | 0 |
| 0.9180555555555556 | 0 |
| 0.9187500000000001 | 0 |
| 0.9194444444444444 | 0 |
| 0.9201388888888888 | 0 |
| 0.9208333333333334 | 0 |
| 0.9215277777777778 | 0 |
| 0.9222222222222222 | 0 |
| 0.9229166666666666 | 0 |
| 0.9236111111111112 | 0 |
| 0.9243055555555556 | 0 |
| 0.9249999999999999 | 0 |
| 0.9256944444444444 | 0 |
| 0.9263888888888889 | 0 |
| 0.9270833333333334 | 0 |
| 0.9277777777777777 | 0 |
| 0.9284722222222223 | 0 |
| 0.9291666666666667 | 0 |
| 0.9298611111111111 | 0 |
| 0.9305555555555555 | 0 |
| 0.93125 | 0 |
| 0.9319444444444445 | 0 |
| 0.9326388888888889 | 0 |
| 0.9333333333333332 | 0 |
| 0.9340277777777778 | 0 |
| 0.9347222222222222 | 0 |
| 0.9354166666666667 | 0 |
| 0.936111111111111 | 0 |
| 0.9368055555555556 | 0 |
| 0.9375 | 0 |
| 0.9381944444444444 | 0 |
| 0.938888888888889 | 0 |
| 0.9395833333333333 | 0 |
| 0.9402777777777778 | 0 |
| 0.9409722222222222 | 0 |
| 0.9416666666666668 | 0 |
| 0.9423611111111111 | 0 |
| 0.9430555555555555 | 0 |
| 0.94375 | 0 |
| 0.9444444444444445 | 0 |
| 0.9451388888888889 | 0 |
| 0.9458333333333333 | 0 |
| 0.9465277777777777 | 0 |
| 0.9472222222222223 | 0 |
| 0.9479166666666666 | 0 |
| 0.9486111111111111 | 0 |
| 0.9493055555555556 | 0 |
| 0.9500000000000001 | 0 |
| 0.9506944444444444 | 0 |
| 0.9513888888888888 | 0 |
| 0.9520833333333334 | 0 |
| 0.9527777777777778 | 0 |
| 0.9534722222222222 | 0 |
| 0.9541666666666666 | 0 |
| 0.9548611111111112 | 0 |
| 0.9555555555555556 | 0 |
| 0.9562499999999999 | 0 |
| 0.9569444444444444 | 0 |
| 0.9576388888888889 | 0 |
| 0.9583333333333334 | 0 |
| 0.9590277777777777 | 0 |
| 0.9597222222222223 | 0 |
| 0.9604166666666667 | 0 |
| 0.9611111111111111 | 0 |
| 0.9618055555555555 | 0 |
| 0.9625 | 0 |
| 0.9631944444444445 | 0 |
| 0.9638888888888889 | 0 |
| 0.9645833333333332 | 0 |
| 0.9652777777777778 | 0 |
| 0.9659722222222222 | 0 |
| 0.9666666666666667 | 0 |
| 0.967361111111111 | 0 |
| 0.9680555555555556 | 0 |
| 0.96875 | 0 |
| 0.9694444444444444 | 0 |
| 0.970138888888889 | 0 |
| 0.9708333333333333 | 0 |
| 0.9715277777777778 | 0 |
| 0.9722222222222222 | 0 |
| 0.9729166666666668 | 0 |
| 0.9736111111111111 | 0 |
| 0.9743055555555555 | 0 |
| 0.975 | 0 |
| 0.9756944444444445 | 0 |
| 0.9763888888888889 | 0 |
| 0.9770833333333333 | 0 |
| 0.9777777777777777 | 0 |
| 0.9784722222222223 | 0 |
| 0.9791666666666666 | 0 |
| 0.9798611111111111 | 0 |
| 0.9805555555555556 | 0 |
| 0.9812500000000001 | 0 |
| 0.9819444444444444 | 0 |
| 0.9826388888888888 | 0 |
| 0.9833333333333334 | 0 |
| 0.9840277777777778 | 0 |
| 0.9847222222222222 | 0 |
| 0.9854166666666666 | 0 |
| 0.9861111111111112 | 0 |
| 0.9868055555555556 | 0 |
| 0.9874999999999999 | 0 |
| 0.9881944444444444 | 0 |
| 0.9888888888888889 | 0 |
| 0.9895833333333334 | 0 |
| 0.9902777777777777 | 0 |
| 0.9909722222222223 | 0 |
| 0.9916666666666667 | 0 |
| 0.9923611111111111 | 0 |
| 0.9930555555555555 | 0 |
| 0.99375 | 0 |
| 0.9944444444444445 | 0 |
| 0.9951388888888889 | 0 |
| 0.9958333333333332 | 0 |
| 0.9965277777777778 | 0 |
| 0.9972222222222222 | 0 |
| 0.9979166666666667 | 0 |
| 0.998611111111111 | 0 |
| 0.9993055555555556 | 0 |